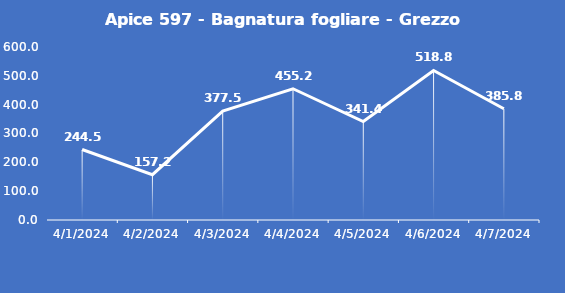
| Category | Apice 597 - Bagnatura fogliare - Grezzo (min) |
|---|---|
| 4/1/24 | 244.5 |
| 4/2/24 | 157.2 |
| 4/3/24 | 377.5 |
| 4/4/24 | 455.2 |
| 4/5/24 | 341.4 |
| 4/6/24 | 518.8 |
| 4/7/24 | 385.8 |